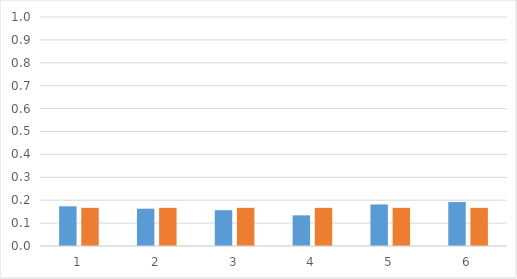
| Category | relfreq | prob |
|---|---|---|
| 0 | 0.173 | 0.167 |
| 1 | 0.163 | 0.167 |
| 2 | 0.156 | 0.167 |
| 3 | 0.134 | 0.167 |
| 4 | 0.181 | 0.167 |
| 5 | 0.192 | 0.167 |